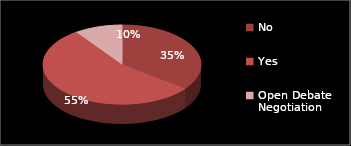
| Category | Series 0 |
|---|---|
| No | 18 |
| Yes | 28 |
| Open Debate Negotiation | 5 |